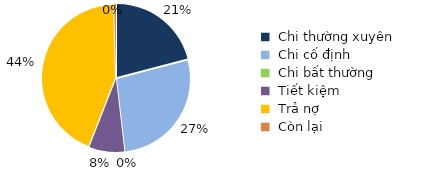
| Category | Series 0 |
|---|---|
| Chi thường xuyên | 0.209 |
| Chi cố định | 0.272 |
| Chi bất thường | 0 |
| Tiết kiệm | 0.078 |
| Trả nợ | 0.436 |
| Còn lại | 0.004 |